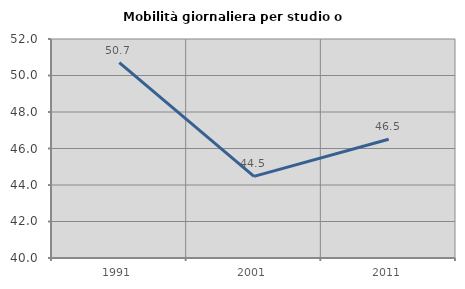
| Category | Mobilità giornaliera per studio o lavoro |
|---|---|
| 1991.0 | 50.701 |
| 2001.0 | 44.475 |
| 2011.0 | 46.504 |